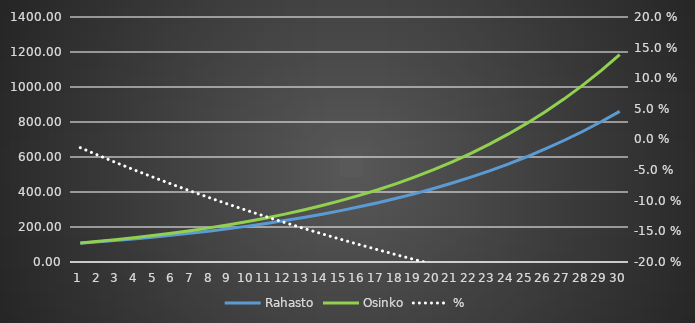
| Category | Rahasto | Osinko |
|---|---|---|
| 1.0 | 107.44 | 108.892 |
| 2.0 | 115.434 | 118.545 |
| 3.0 | 124.022 | 129.019 |
| 4.0 | 133.249 | 140.386 |
| 5.0 | 143.163 | 152.718 |
| 6.0 | 153.814 | 166.096 |
| 7.0 | 165.258 | 180.607 |
| 8.0 | 177.553 | 196.344 |
| 9.0 | 190.763 | 213.41 |
| 10.0 | 204.956 | 231.915 |
| 11.0 | 220.204 | 251.977 |
| 12.0 | 236.588 | 273.726 |
| 13.0 | 254.19 | 297.3 |
| 14.0 | 273.101 | 322.851 |
| 15.0 | 293.42 | 350.541 |
| 16.0 | 315.251 | 380.546 |
| 17.0 | 338.705 | 413.058 |
| 18.0 | 363.905 | 448.282 |
| 19.0 | 390.98 | 486.442 |
| 20.0 | 420.068 | 527.778 |
| 21.0 | 451.321 | 572.552 |
| 22.0 | 484.9 | 621.045 |
| 23.0 | 520.976 | 673.563 |
| 24.0 | 559.737 | 730.435 |
| 25.0 | 601.381 | 792.018 |
| 26.0 | 646.124 | 858.697 |
| 27.0 | 694.196 | 930.889 |
| 28.0 | 745.844 | 1009.046 |
| 29.0 | 801.335 | 1093.653 |
| 30.0 | 860.954 | 1185.239 |